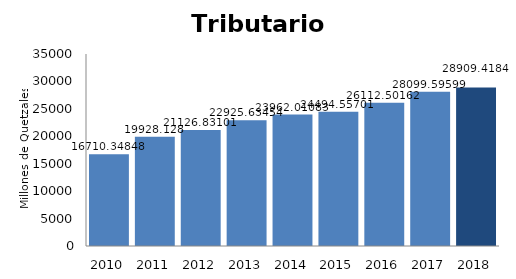
| Category | Tributarios |
|---|---|
| 2010.0 | 16710.348 |
| 2011.0 | 19928.128 |
| 2012.0 | 21126.831 |
| 2013.0 | 22925.635 |
| 2014.0 | 23962.011 |
| 2015.0 | 24494.557 |
| 2016.0 | 26112.502 |
| 2017.0 | 28099.596 |
| 2018.0 | 28909.418 |